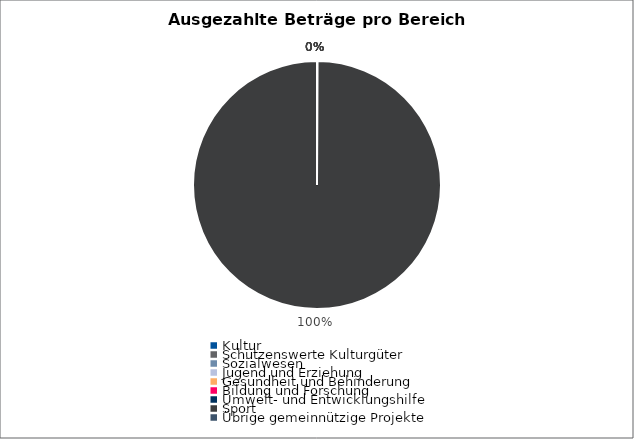
| Category | Series 0 |
|---|---|
| Kultur | 0 |
| Schützenswerte Kulturgüter | 0 |
| Sozialwesen | 0 |
| Jugend und Erziehung | 0 |
| Gesundheit und Behinderung | 0 |
| Bildung und Forschung | 0 |
| Umwelt- und Entwicklungshilfe | 0 |
| Sport | 5215292.62 |
| Übrige gemeinnützige Projekte | 0 |